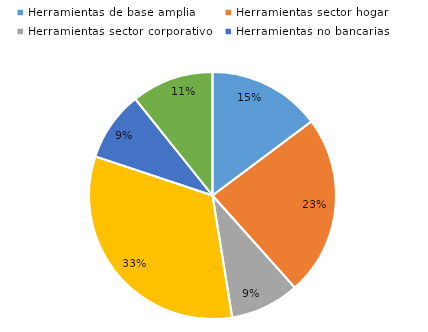
| Category | Series 0 |
|---|---|
| Herramientas de base amplia | 194 |
| Herramientas sector hogar | 310 |
| Herramientas sector corporativo | 119 |
| Herramientas de liquidez | 429 |
| Herramientas no bancarias | 120 |
| Herramientas estructurales | 141 |